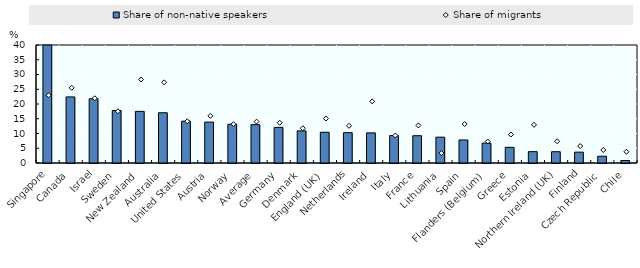
| Category | Share of non-native speakers |
|---|---|
| Singapore | 71.357 |
| Canada | 22.397 |
| Israel | 21.786 |
| Sweden | 17.801 |
| New Zealand | 17.502 |
| Australia | 17.039 |
| United States | 14.18 |
| Austria | 13.868 |
| Norway | 13.137 |
| Average | 12.984 |
| Germany | 12.074 |
| Denmark | 10.885 |
| England (UK) | 10.42 |
| Netherlands | 10.277 |
| Ireland | 10.214 |
| Italy | 9.297 |
| France | 9.25 |
| Lithuania | 8.76 |
| Spain | 7.815 |
| Flanders (Belgium) | 6.743 |
| Greece | 5.305 |
| Estonia | 3.85 |
| Northern Ireland (UK) | 3.828 |
| Finland | 3.678 |
| Czech Republic | 2.299 |
| Chile | 0.829 |